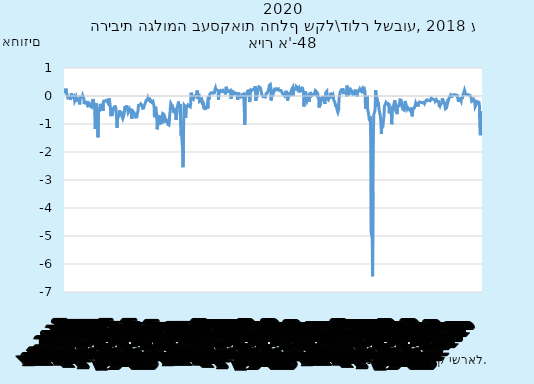
| Category | הריבית הגלומה בעסקאות החלף - שקל\דולר |
|---|---|
| 2018-01-01 | 0.102 |
| 2018-01-02 | 0.222 |
| 2018-01-03 | 0.263 |
| 2018-01-04 | 0.066 |
| 2018-01-05 | 0.102 |
| 2018-01-06 | 0.102 |
| 2018-01-07 | 0.102 |
| 2018-01-08 | -0.067 |
| 2018-01-09 | -0.054 |
| 2018-01-10 | -0.064 |
| 2018-01-11 | -0.05 |
| 2018-01-12 | -0.033 |
| 2018-01-13 | -0.033 |
| 2018-01-14 | -0.033 |
| 2018-01-15 | -0.141 |
| 2018-01-16 | -0.043 |
| 2018-01-17 | 0.098 |
| 2018-01-18 | 0.023 |
| 2018-01-19 | -0.019 |
| 2018-01-20 | -0.019 |
| 2018-01-21 | -0.019 |
| 2018-01-22 | -0.047 |
| 2018-01-23 | -0.054 |
| 2018-01-24 | -0.008 |
| 2018-01-25 | -0.062 |
| 2018-01-26 | -0.181 |
| 2018-01-27 | -0.181 |
| 2018-01-28 | -0.181 |
| 2018-01-29 | -0.092 |
| 2018-01-30 | -0.044 |
| 2018-01-31 | -0.092 |
| 2018-02-01 | -0.156 |
| 2018-02-02 | -0.142 |
| 2018-02-03 | -0.142 |
| 2018-02-04 | -0.142 |
| 2018-02-05 | -0.092 |
| 2018-02-06 | -0.152 |
| 2018-02-07 | -0.127 |
| 2018-02-08 | -0.3 |
| 2018-02-09 | -0.037 |
| 2018-02-10 | -0.037 |
| 2018-02-11 | -0.037 |
| 2018-02-12 | -0.046 |
| 2018-02-13 | -0.013 |
| 2018-02-14 | -0.025 |
| 2018-02-15 | -0.048 |
| 2018-02-16 | 0.014 |
| 2018-02-17 | 0.014 |
| 2018-02-18 | 0.014 |
| 2018-02-19 | -0.089 |
| 2018-02-20 | -0.288 |
| 2018-02-21 | -0.194 |
| 2018-02-22 | -0.238 |
| 2018-02-23 | -0.225 |
| 2018-02-24 | -0.225 |
| 2018-02-25 | -0.225 |
| 2018-02-26 | -0.24 |
| 2018-02-27 | -0.279 |
| 2018-02-28 | -0.177 |
| 2018-03-01 | -0.394 |
| 2018-03-02 | -0.32 |
| 2018-03-03 | -0.32 |
| 2018-03-04 | -0.32 |
| 2018-03-05 | -0.278 |
| 2018-03-06 | -0.275 |
| 2018-03-07 | -0.308 |
| 2018-03-08 | -0.36 |
| 2018-03-09 | -0.395 |
| 2018-03-10 | -0.395 |
| 2018-03-11 | -0.395 |
| 2018-03-12 | -0.322 |
| 2018-03-13 | -0.213 |
| 2018-03-14 | -0.237 |
| 2018-03-15 | -0.107 |
| 2018-03-16 | -0.192 |
| 2018-03-17 | -0.192 |
| 2018-03-18 | -0.192 |
| 2018-03-19 | -0.381 |
| 2018-03-20 | -0.816 |
| 2018-03-21 | -1.178 |
| 2018-03-22 | -0.298 |
| 2018-03-23 | -0.255 |
| 2018-03-24 | -0.255 |
| 2018-03-25 | -0.255 |
| 2018-03-26 | -0.576 |
| 2018-03-27 | -0.474 |
| 2018-03-28 | -1.474 |
| 2018-03-29 | -0.523 |
| 2018-03-30 | -0.517 |
| 2018-03-31 | -0.517 |
| 2018-04-01 | -0.517 |
| 2018-04-02 | -0.509 |
| 2018-04-03 | -0.282 |
| 2018-04-04 | -0.365 |
| 2018-04-05 | -0.435 |
| 2018-04-06 | -0.43 |
| 2018-04-07 | -0.43 |
| 2018-04-08 | -0.43 |
| 2018-04-09 | -0.36 |
| 2018-04-10 | -0.536 |
| 2018-04-11 | -0.235 |
| 2018-04-12 | -0.184 |
| 2018-04-13 | -0.188 |
| 2018-04-14 | -0.188 |
| 2018-04-15 | -0.188 |
| 2018-04-16 | -0.222 |
| 2018-04-17 | -0.161 |
| 2018-04-18 | -0.158 |
| 2018-04-19 | -0.187 |
| 2018-04-20 | -0.19 |
| 2018-04-21 | -0.19 |
| 2018-04-22 | -0.19 |
| 2018-04-23 | -0.243 |
| 2018-04-24 | -0.187 |
| 2018-04-25 | -0.135 |
| 2018-04-26 | -0.081 |
| 2018-04-27 | -0.13 |
| 2018-04-28 | -0.13 |
| 2018-04-29 | -0.13 |
| 2018-04-30 | -0.459 |
| 2018-05-01 | -0.72 |
| 2018-05-02 | -0.419 |
| 2018-05-03 | -0.41 |
| 2018-05-04 | -0.708 |
| 2018-05-05 | -0.708 |
| 2018-05-06 | -0.708 |
| 2018-05-07 | -0.437 |
| 2018-05-08 | -0.408 |
| 2018-05-09 | -0.435 |
| 2018-05-10 | -0.416 |
| 2018-05-11 | -0.341 |
| 2018-05-12 | -0.341 |
| 2018-05-13 | -0.341 |
| 2018-05-14 | -0.463 |
| 2018-05-15 | -0.604 |
| 2018-05-16 | -0.606 |
| 2018-05-17 | -1.14 |
| 2018-05-18 | -0.83 |
| 2018-05-19 | -0.83 |
| 2018-05-20 | -0.83 |
| 2018-05-21 | -0.711 |
| 2018-05-22 | -0.658 |
| 2018-05-23 | -0.596 |
| 2018-05-24 | -0.511 |
| 2018-05-25 | -0.622 |
| 2018-05-26 | -0.622 |
| 2018-05-27 | -0.622 |
| 2018-05-28 | -0.606 |
| 2018-05-29 | -0.714 |
| 2018-05-30 | -0.722 |
| 2018-05-31 | -0.765 |
| 2018-06-01 | -0.805 |
| 2018-06-02 | -0.805 |
| 2018-06-03 | -0.805 |
| 2018-06-04 | -0.675 |
| 2018-06-05 | -0.595 |
| 2018-06-06 | -0.419 |
| 2018-06-07 | -0.413 |
| 2018-06-08 | -0.428 |
| 2018-06-09 | -0.428 |
| 2018-06-10 | -0.428 |
| 2018-06-11 | -0.331 |
| 2018-06-12 | -0.35 |
| 2018-06-13 | -0.441 |
| 2018-06-14 | -0.447 |
| 2018-06-15 | -0.586 |
| 2018-06-16 | -0.586 |
| 2018-06-17 | -0.586 |
| 2018-06-18 | -0.493 |
| 2018-06-19 | -0.559 |
| 2018-06-20 | -0.512 |
| 2018-06-21 | -0.489 |
| 2018-06-22 | -0.447 |
| 2018-06-23 | -0.447 |
| 2018-06-24 | -0.447 |
| 2018-06-25 | -0.803 |
| 2018-06-26 | -0.495 |
| 2018-06-27 | -0.554 |
| 2018-06-28 | -0.578 |
| 2018-06-29 | -0.583 |
| 2018-06-30 | -0.583 |
| 2018-07-01 | -0.583 |
| 2018-07-02 | -0.634 |
| 2018-07-03 | -0.627 |
| 2018-07-04 | -0.695 |
| 2018-07-05 | -0.756 |
| 2018-07-06 | -0.748 |
| 2018-07-07 | -0.748 |
| 2018-07-08 | -0.748 |
| 2018-07-09 | -0.64 |
| 2018-07-10 | -0.641 |
| 2018-07-11 | -0.532 |
| 2018-07-12 | -0.336 |
| 2018-07-13 | -0.325 |
| 2018-07-14 | -0.325 |
| 2018-07-15 | -0.325 |
| 2018-07-16 | -0.292 |
| 2018-07-17 | -0.304 |
| 2018-07-18 | -0.276 |
| 2018-07-19 | -0.299 |
| 2018-07-20 | -0.313 |
| 2018-07-21 | -0.313 |
| 2018-07-22 | -0.313 |
| 2018-07-23 | -0.441 |
| 2018-07-24 | -0.445 |
| 2018-07-25 | -0.417 |
| 2018-07-26 | -0.429 |
| 2018-07-27 | -0.354 |
| 2018-07-28 | -0.354 |
| 2018-07-29 | -0.354 |
| 2018-07-30 | -0.256 |
| 2018-07-31 | -0.216 |
| 2018-08-01 | -0.164 |
| 2018-08-02 | -0.14 |
| 2018-08-03 | -0.152 |
| 2018-08-04 | -0.152 |
| 2018-08-05 | -0.152 |
| 2018-08-06 | -0.054 |
| 2018-08-07 | -0.075 |
| 2018-08-08 | -0.084 |
| 2018-08-09 | -0.15 |
| 2018-08-10 | -0.17 |
| 2018-08-11 | -0.17 |
| 2018-08-12 | -0.17 |
| 2018-08-13 | -0.247 |
| 2018-08-14 | -0.176 |
| 2018-08-15 | -0.168 |
| 2018-08-16 | -0.221 |
| 2018-08-17 | -0.189 |
| 2018-08-18 | -0.189 |
| 2018-08-19 | -0.189 |
| 2018-08-20 | -0.255 |
| 2018-08-21 | -0.265 |
| 2018-08-22 | -0.356 |
| 2018-08-23 | -0.757 |
| 2018-08-24 | -0.442 |
| 2018-08-25 | -0.442 |
| 2018-08-26 | -0.442 |
| 2018-08-27 | -0.429 |
| 2018-08-28 | -0.573 |
| 2018-08-29 | -0.648 |
| 2018-08-30 | -1.189 |
| 2018-08-31 | -1.149 |
| 2018-09-01 | -1.149 |
| 2018-09-02 | -1.149 |
| 2018-09-03 | -0.748 |
| 2018-09-04 | -0.692 |
| 2018-09-05 | -0.724 |
| 2018-09-06 | -1.032 |
| 2018-09-07 | -0.843 |
| 2018-09-08 | -0.843 |
| 2018-09-09 | -0.843 |
| 2018-09-10 | -0.812 |
| 2018-09-11 | -0.81 |
| 2018-09-12 | -0.704 |
| 2018-09-13 | -0.977 |
| 2018-09-14 | -0.629 |
| 2018-09-15 | -0.629 |
| 2018-09-16 | -0.629 |
| 2018-09-17 | -0.656 |
| 2018-09-18 | -0.633 |
| 2018-09-19 | -0.659 |
| 2018-09-20 | -0.788 |
| 2018-09-21 | -0.895 |
| 2018-09-22 | -0.895 |
| 2018-09-23 | -0.895 |
| 2018-09-24 | -0.875 |
| 2018-09-25 | -0.856 |
| 2018-09-26 | -0.909 |
| 2018-09-27 | -1.009 |
| 2018-09-28 | -1.038 |
| 2018-09-29 | -1.038 |
| 2018-09-30 | -1.038 |
| 2018-10-01 | -0.928 |
| 2018-10-02 | -0.668 |
| 2018-10-03 | -0.594 |
| 2018-10-04 | -0.384 |
| 2018-10-05 | -0.272 |
| 2018-10-06 | -0.272 |
| 2018-10-07 | -0.272 |
| 2018-10-08 | -0.357 |
| 2018-10-09 | -0.317 |
| 2018-10-10 | -0.407 |
| 2018-10-11 | -0.475 |
| 2018-10-12 | -0.56 |
| 2018-10-13 | -0.56 |
| 2018-10-14 | -0.56 |
| 2018-10-15 | -0.577 |
| 2018-10-16 | -0.57 |
| 2018-10-17 | -0.436 |
| 2018-10-18 | -0.427 |
| 2018-10-19 | -0.858 |
| 2018-10-20 | -0.858 |
| 2018-10-21 | -0.858 |
| 2018-10-22 | -0.39 |
| 2018-10-23 | -0.342 |
| 2018-10-24 | -0.291 |
| 2018-10-25 | -0.2 |
| 2018-10-26 | -0.343 |
| 2018-10-27 | -0.343 |
| 2018-10-28 | -0.343 |
| 2018-10-29 | -0.407 |
| 2018-10-30 | -0.299 |
| 2018-10-31 | -1.076 |
| 2018-11-01 | -1.416 |
| 2018-11-02 | -1.114 |
| 2018-11-03 | -1.114 |
| 2018-11-04 | -1.114 |
| 2018-11-05 | -1.946 |
| 2018-11-06 | -2.541 |
| 2018-11-07 | -1.599 |
| 2018-11-08 | -0.68 |
| 2018-11-09 | -0.319 |
| 2018-11-10 | -0.319 |
| 2018-11-11 | -0.319 |
| 2018-11-12 | -0.365 |
| 2018-11-13 | -0.774 |
| 2018-11-14 | -0.436 |
| 2018-11-15 | -0.423 |
| 2018-11-16 | -0.4 |
| 2018-11-17 | -0.4 |
| 2018-11-18 | -0.4 |
| 2018-11-19 | -0.321 |
| 2018-11-20 | -0.286 |
| 2018-11-21 | -0.344 |
| 2018-11-22 | -0.365 |
| 2018-11-23 | -0.389 |
| 2018-11-24 | -0.389 |
| 2018-11-25 | -0.389 |
| 2018-11-26 | -0.287 |
| 2018-11-27 | 0.119 |
| 2018-11-28 | 0.108 |
| 2018-11-29 | 0.021 |
| 2018-11-30 | -0.094 |
| 2018-12-01 | -0.094 |
| 2018-12-02 | -0.094 |
| 2018-12-03 | -0.123 |
| 2018-12-04 | -0.077 |
| 2018-12-05 | -0.078 |
| 2018-12-06 | 0 |
| 2018-12-07 | 0.014 |
| 2018-12-08 | 0.014 |
| 2018-12-09 | 0.014 |
| 2018-12-10 | 0.017 |
| 2018-12-11 | -0.014 |
| 2018-12-12 | 0.064 |
| 2018-12-13 | 0.198 |
| 2018-12-14 | -0.096 |
| 2018-12-15 | -0.096 |
| 2018-12-16 | -0.096 |
| 2018-12-17 | 0.081 |
| 2018-12-18 | 0.012 |
| 2018-12-19 | -0.201 |
| 2018-12-20 | -0.219 |
| 2018-12-21 | -0.18 |
| 2018-12-22 | -0.18 |
| 2018-12-23 | -0.18 |
| 2018-12-24 | -0.056 |
| 2018-12-25 | -0.054 |
| 2018-12-26 | -0.192 |
| 2018-12-27 | -0.31 |
| 2018-12-28 | -0.206 |
| 2018-12-29 | -0.206 |
| 2018-12-30 | -0.206 |
| 2018-12-31 | -0.442 |
| 2019-01-01 | -0.439 |
| 2019-01-02 | -0.414 |
| 2019-01-03 | -0.457 |
| 2019-01-04 | -0.433 |
| 2019-01-05 | -0.433 |
| 2019-01-06 | -0.433 |
| 2019-01-07 | -0.437 |
| 2019-01-08 | -0.329 |
| 2019-01-09 | -0.242 |
| 2019-01-10 | -0.442 |
| 2019-01-11 | -0.07 |
| 2019-01-12 | -0.07 |
| 2019-01-13 | -0.07 |
| 2019-01-14 | -0.079 |
| 2019-01-15 | 0.062 |
| 2019-01-16 | 0.069 |
| 2019-01-17 | 0.095 |
| 2019-01-18 | 0.109 |
| 2019-01-19 | 0.109 |
| 2019-01-20 | 0.109 |
| 2019-01-21 | 0.119 |
| 2019-01-22 | 0.128 |
| 2019-01-23 | 0.114 |
| 2019-01-24 | 0.102 |
| 2019-01-25 | 0.111 |
| 2019-01-26 | 0.111 |
| 2019-01-27 | 0.111 |
| 2019-01-28 | 0.126 |
| 2019-01-29 | 0.251 |
| 2019-01-30 | 0.289 |
| 2019-01-31 | 0.224 |
| 2019-02-01 | 0.226 |
| 2019-02-02 | 0.226 |
| 2019-02-03 | 0.226 |
| 2019-02-04 | 0.258 |
| 2019-02-05 | 0.224 |
| 2019-02-06 | 0.176 |
| 2019-02-07 | -0.139 |
| 2019-02-08 | 0.156 |
| 2019-02-09 | 0.156 |
| 2019-02-10 | 0.156 |
| 2019-02-11 | 0.186 |
| 2019-02-12 | 0.143 |
| 2019-02-13 | 0.159 |
| 2019-02-14 | 0.155 |
| 2019-02-15 | 0.17 |
| 2019-02-16 | 0.17 |
| 2019-02-17 | 0.17 |
| 2019-02-18 | 0.203 |
| 2019-02-19 | 0.182 |
| 2019-02-20 | 0.156 |
| 2019-02-21 | 0.157 |
| 2019-02-22 | 0.142 |
| 2019-02-23 | 0.142 |
| 2019-02-24 | 0.142 |
| 2019-02-25 | 0.06 |
| 2019-02-26 | 0.216 |
| 2019-02-27 | 0.33 |
| 2019-02-28 | 0.295 |
| 2019-03-01 | 0.246 |
| 2019-03-02 | 0.246 |
| 2019-03-03 | 0.246 |
| 2019-03-04 | 0.159 |
| 2019-03-05 | 0.177 |
| 2019-03-06 | 0.172 |
| 2019-03-07 | 0.177 |
| 2019-03-08 | 0.198 |
| 2019-03-09 | 0.198 |
| 2019-03-10 | 0.198 |
| 2019-03-11 | 0.198 |
| 2019-03-12 | -0.105 |
| 2019-03-13 | 0.174 |
| 2019-03-14 | 0.188 |
| 2019-03-15 | 0.174 |
| 2019-03-16 | 0.174 |
| 2019-03-17 | 0.174 |
| 2019-03-18 | 0.167 |
| 2019-03-19 | 0.135 |
| 2019-03-20 | 0.074 |
| 2019-03-21 | 0.054 |
| 2019-03-22 | 0.103 |
| 2019-03-23 | 0.103 |
| 2019-03-24 | 0.103 |
| 2019-03-25 | 0.124 |
| 2019-03-26 | 0.103 |
| 2019-03-27 | 0.143 |
| 2019-03-28 | 0.139 |
| 2019-03-29 | -0.138 |
| 2019-03-30 | -0.138 |
| 2019-03-31 | -0.138 |
| 2019-04-01 | 0.117 |
| 2019-04-02 | 0.042 |
| 2019-04-03 | -0.086 |
| 2019-04-04 | -0.048 |
| 2019-04-05 | -0.014 |
| 2019-04-06 | -0.014 |
| 2019-04-07 | -0.014 |
| 2019-04-08 | -0.021 |
| 2019-04-09 | -0.03 |
| 2019-04-10 | -0.027 |
| 2019-04-11 | 0.06 |
| 2019-04-12 | 0.072 |
| 2019-04-13 | 0.072 |
| 2019-04-14 | 0.072 |
| 2019-04-15 | 0.107 |
| 2019-04-16 | 0.056 |
| 2019-04-17 | -1.027 |
| 2019-04-18 | 0.037 |
| 2019-04-19 | 0.016 |
| 2019-04-20 | 0.016 |
| 2019-04-21 | 0.016 |
| 2019-04-22 | 0.037 |
| 2019-04-23 | 0.124 |
| 2019-04-24 | 0.173 |
| 2019-04-25 | 0.159 |
| 2019-04-26 | 0.187 |
| 2019-04-27 | 0.187 |
| 2019-04-28 | 0.187 |
| 2019-04-29 | 0.116 |
| 2019-04-30 | -0.217 |
| 2019-05-01 | 0.085 |
| 2019-05-02 | 0.165 |
| 2019-05-03 | 0.22 |
| 2019-05-04 | 0.22 |
| 2019-05-05 | 0.22 |
| 2019-05-06 | 0.2 |
| 2019-05-07 | 0.198 |
| 2019-05-08 | 0.222 |
| 2019-05-09 | 0.232 |
| 2019-05-10 | 0.237 |
| 2019-05-11 | 0.237 |
| 2019-05-12 | 0.237 |
| 2019-05-13 | 0.29 |
| 2019-05-14 | 0.35 |
| 2019-05-15 | 0.234 |
| 2019-05-16 | -0.179 |
| 2019-05-17 | 0.15 |
| 2019-05-18 | 0.15 |
| 2019-05-19 | 0.15 |
| 2019-05-20 | 0.072 |
| 2019-05-21 | 0.175 |
| 2019-05-22 | 0.234 |
| 2019-05-23 | 0.213 |
| 2019-05-24 | 0.327 |
| 2019-05-25 | 0.327 |
| 2019-05-26 | 0.327 |
| 2019-05-27 | 0.306 |
| 2019-05-28 | 0.316 |
| 2019-05-29 | 0.24 |
| 2019-05-30 | 0.188 |
| 2019-05-31 | 0.065 |
| 2019-06-01 | 0.065 |
| 2019-06-02 | 0.065 |
| 2019-06-03 | 0.003 |
| 2019-06-04 | 0.027 |
| 2019-06-05 | -0.072 |
| 2019-06-06 | 0.036 |
| 2019-06-07 | -0.018 |
| 2019-06-08 | -0.018 |
| 2019-06-09 | -0.018 |
| 2019-06-10 | -0.034 |
| 2019-06-11 | 0.012 |
| 2019-06-12 | 0.089 |
| 2019-06-13 | 0.117 |
| 2019-06-14 | 0.105 |
| 2019-06-15 | 0.105 |
| 2019-06-16 | 0.105 |
| 2019-06-17 | 0.133 |
| 2019-06-18 | 0.216 |
| 2019-06-19 | 0.277 |
| 2019-06-20 | 0.38 |
| 2019-06-21 | 0.413 |
| 2019-06-22 | 0.413 |
| 2019-06-23 | 0.413 |
| 2019-06-24 | 0.301 |
| 2019-06-25 | -0.158 |
| 2019-06-26 | 0.128 |
| 2019-06-27 | 0.116 |
| 2019-06-28 | 0.159 |
| 2019-06-29 | 0.159 |
| 2019-06-30 | 0.159 |
| 2019-07-01 | 0.197 |
| 2019-07-02 | 0.142 |
| 2019-07-03 | 0.188 |
| 2019-07-04 | 0.198 |
| 2019-07-05 | 0.207 |
| 2019-07-06 | 0.207 |
| 2019-07-07 | 0.207 |
| 2019-07-08 | 0.259 |
| 2019-07-09 | 0.276 |
| 2019-07-10 | 0.236 |
| 2019-07-11 | 0.231 |
| 2019-07-12 | 0.254 |
| 2019-07-13 | 0.254 |
| 2019-07-14 | 0.254 |
| 2019-07-15 | 0.207 |
| 2019-07-16 | 0.2 |
| 2019-07-17 | 0.182 |
| 2019-07-18 | 0.199 |
| 2019-07-19 | 0.197 |
| 2019-07-20 | 0.197 |
| 2019-07-21 | 0.197 |
| 2019-07-22 | 0.176 |
| 2019-07-23 | 0.148 |
| 2019-07-24 | 0.1 |
| 2019-07-25 | 0.118 |
| 2019-07-26 | 0.07 |
| 2019-07-27 | 0.07 |
| 2019-07-28 | 0.07 |
| 2019-07-29 | 0.048 |
| 2019-07-30 | 0.012 |
| 2019-07-31 | 0.003 |
| 2019-08-01 | 0.089 |
| 2019-08-02 | 0.144 |
| 2019-08-03 | 0.144 |
| 2019-08-04 | 0.144 |
| 2019-08-05 | 0.141 |
| 2019-08-06 | 0.119 |
| 2019-08-07 | -0.163 |
| 2019-08-08 | -0.196 |
| 2019-08-09 | -0.009 |
| 2019-08-10 | -0.009 |
| 2019-08-11 | -0.009 |
| 2019-08-12 | 0.123 |
| 2019-08-13 | 0.122 |
| 2019-08-14 | -0.008 |
| 2019-08-15 | 0.066 |
| 2019-08-16 | 0.158 |
| 2019-08-17 | 0.158 |
| 2019-08-18 | 0.158 |
| 2019-08-19 | 0.268 |
| 2019-08-20 | 0.267 |
| 2019-08-21 | 0.314 |
| 2019-08-22 | 0.017 |
| 2019-08-23 | 0.269 |
| 2019-08-24 | 0.269 |
| 2019-08-25 | 0.269 |
| 2019-08-26 | 0.241 |
| 2019-08-27 | 0.244 |
| 2019-08-28 | 0.232 |
| 2019-08-29 | 0.239 |
| 2019-08-30 | 0.337 |
| 2019-08-31 | 0.337 |
| 2019-09-01 | 0.337 |
| 2019-09-02 | 0.298 |
| 2019-09-03 | 0.248 |
| 2019-09-04 | 0.26 |
| 2019-09-05 | 0.285 |
| 2019-09-06 | 0.129 |
| 2019-09-07 | 0.129 |
| 2019-09-08 | 0.129 |
| 2019-09-09 | 0.247 |
| 2019-09-10 | 0.272 |
| 2019-09-11 | 0.265 |
| 2019-09-12 | 0.279 |
| 2019-09-13 | 0.212 |
| 2019-09-14 | 0.212 |
| 2019-09-15 | 0.212 |
| 2019-09-16 | 0.242 |
| 2019-09-17 | 0.207 |
| 2019-09-18 | 0.093 |
| 2019-09-19 | -0.376 |
| 2019-09-20 | -0.103 |
| 2019-09-21 | -0.103 |
| 2019-09-22 | -0.103 |
| 2019-09-23 | 0.172 |
| 2019-09-24 | 0.14 |
| 2019-09-25 | 0.183 |
| 2019-09-26 | -0.124 |
| 2019-09-27 | -0.171 |
| 2019-09-28 | -0.171 |
| 2019-09-29 | -0.171 |
| 2019-09-30 | -0.033 |
| 2019-10-01 | 0.04 |
| 2019-10-02 | 0.043 |
| 2019-10-03 | -0.206 |
| 2019-10-04 | 0.091 |
| 2019-10-05 | 0.091 |
| 2019-10-06 | 0.091 |
| 2019-10-07 | 0.104 |
| 2019-10-08 | 0.099 |
| 2019-10-09 | 0.064 |
| 2019-10-10 | 0.013 |
| 2019-10-11 | 0.044 |
| 2019-10-12 | 0.044 |
| 2019-10-13 | 0.044 |
| 2019-10-14 | 0.021 |
| 2019-10-15 | 0.042 |
| 2019-10-16 | 0.053 |
| 2019-10-17 | 0.098 |
| 2019-10-18 | 0.152 |
| 2019-10-19 | 0.152 |
| 2019-10-20 | 0.152 |
| 2019-10-21 | 0.073 |
| 2019-10-22 | 0.143 |
| 2019-10-23 | 0.164 |
| 2019-10-24 | 0.13 |
| 2019-10-25 | 0.088 |
| 2019-10-26 | 0.088 |
| 2019-10-27 | 0.088 |
| 2019-10-28 | -0.12 |
| 2019-10-29 | -0.412 |
| 2019-10-30 | -0.059 |
| 2019-10-31 | -0.358 |
| 2019-11-01 | -0.108 |
| 2019-11-02 | -0.108 |
| 2019-11-03 | -0.108 |
| 2019-11-04 | -0.14 |
| 2019-11-05 | -0.123 |
| 2019-11-06 | -0.049 |
| 2019-11-07 | -0.043 |
| 2019-11-08 | -0.044 |
| 2019-11-09 | -0.044 |
| 2019-11-10 | -0.044 |
| 2019-11-11 | -0.076 |
| 2019-11-12 | -0.218 |
| 2019-11-13 | -0.286 |
| 2019-11-14 | -0.028 |
| 2019-11-15 | 0.116 |
| 2019-11-16 | 0.116 |
| 2019-11-17 | 0.116 |
| 2019-11-18 | 0.165 |
| 2019-11-19 | -0.096 |
| 2019-11-20 | -0.07 |
| 2019-11-21 | -0.11 |
| 2019-11-22 | -0.137 |
| 2019-11-23 | -0.137 |
| 2019-11-24 | -0.137 |
| 2019-11-25 | 0.01 |
| 2019-11-26 | -0.103 |
| 2019-11-27 | 0.021 |
| 2019-11-28 | 0.115 |
| 2019-11-29 | 0.06 |
| 2019-11-30 | 0.06 |
| 2019-12-01 | 0.06 |
| 2019-12-02 | 0.01 |
| 2019-12-03 | 0.019 |
| 2019-12-04 | 0.05 |
| 2019-12-05 | -0.005 |
| 2019-12-06 | -0.142 |
| 2019-12-07 | -0.142 |
| 2019-12-08 | -0.142 |
| 2019-12-09 | -0.218 |
| 2019-12-10 | -0.187 |
| 2019-12-11 | -0.338 |
| 2019-12-12 | -0.385 |
| 2019-12-13 | -0.313 |
| 2019-12-14 | -0.313 |
| 2019-12-15 | -0.313 |
| 2019-12-16 | -0.541 |
| 2019-12-17 | -0.582 |
| 2019-12-18 | -0.581 |
| 2019-12-19 | -0.486 |
| 2019-12-20 | -0.093 |
| 2019-12-21 | -0.093 |
| 2019-12-22 | -0.093 |
| 2019-12-23 | 0.137 |
| 2019-12-24 | 0.172 |
| 2019-12-25 | 0.2 |
| 2019-12-26 | 0.188 |
| 2019-12-27 | 0.181 |
| 2019-12-28 | 0.181 |
| 2019-12-29 | 0.181 |
| 2019-12-30 | 0.273 |
| 2019-12-31 | 0.119 |
| 2020-01-01 | 0.123 |
| 2020-01-02 | 0.117 |
| 2020-01-03 | 0.124 |
| 2020-01-04 | 0.124 |
| 2020-01-05 | 0.124 |
| 2020-01-06 | 0.108 |
| 2020-01-07 | 0.095 |
| 2020-01-08 | 0.161 |
| 2020-01-09 | -0.014 |
| 2020-01-10 | 0.369 |
| 2020-01-11 | 0.369 |
| 2020-01-12 | 0.369 |
| 2020-01-13 | 0.122 |
| 2020-01-14 | 0.005 |
| 2020-01-15 | 0.081 |
| 2020-01-16 | 0.186 |
| 2020-01-17 | 0.296 |
| 2020-01-18 | 0.296 |
| 2020-01-19 | 0.296 |
| 2020-01-20 | 0.151 |
| 2020-01-21 | 0.144 |
| 2020-01-22 | 0.146 |
| 2020-01-23 | 0.167 |
| 2020-01-24 | 0.082 |
| 2020-01-25 | 0.082 |
| 2020-01-26 | 0.082 |
| 2020-01-27 | 0.058 |
| 2020-01-28 | 0.019 |
| 2020-01-29 | 0.143 |
| 2020-01-30 | 0.166 |
| 2020-01-31 | 0.19 |
| 2020-02-01 | 0.19 |
| 2020-02-02 | 0.19 |
| 2020-02-03 | 0.185 |
| 2020-02-04 | 0.201 |
| 2020-02-05 | 0.184 |
| 2020-02-06 | -0.02 |
| 2020-02-07 | 0.158 |
| 2020-02-08 | 0.158 |
| 2020-02-09 | 0.158 |
| 2020-02-10 | 0.197 |
| 2020-02-11 | 0.213 |
| 2020-02-12 | 0.25 |
| 2020-02-13 | 0.22 |
| 2020-02-14 | 0.176 |
| 2020-02-15 | 0.176 |
| 2020-02-16 | 0.176 |
| 2020-02-17 | 0.166 |
| 2020-02-18 | 0.186 |
| 2020-02-19 | 0.222 |
| 2020-02-20 | 0.096 |
| 2020-02-21 | 0.289 |
| 2020-02-22 | 0.289 |
| 2020-02-23 | 0.289 |
| 2020-02-24 | 0.286 |
| 2020-02-25 | 0.223 |
| 2020-02-26 | 0.162 |
| 2020-02-27 | -0.23 |
| 2020-02-28 | -0.461 |
| 2020-02-29 | -0.461 |
| 2020-03-01 | -0.461 |
| 2020-03-02 | -0.289 |
| 2020-03-03 | 0.007 |
| 2020-03-04 | -0.479 |
| 2020-03-05 | -0.492 |
| 2020-03-06 | -0.595 |
| 2020-03-07 | -0.595 |
| 2020-03-08 | -0.595 |
| 2020-03-09 | -0.891 |
| 2020-03-10 | -0.902 |
| 2020-03-11 | -0.727 |
| 2020-03-12 | -1.401 |
| 2020-03-13 | -4.846 |
| 2020-03-14 | -4.846 |
| 2020-03-15 | -4.846 |
| 2020-03-16 | -5.098 |
| 2020-03-17 | -6.439 |
| 2020-03-18 | -3.416 |
| 2020-03-19 | -1.561 |
| 2020-03-20 | -0.657 |
| 2020-03-21 | -0.657 |
| 2020-03-22 | -0.657 |
| 2020-03-23 | -0.543 |
| 2020-03-24 | -0.355 |
| 2020-03-25 | 0.211 |
| 2020-03-26 | 0.058 |
| 2020-03-27 | 0.01 |
| 2020-03-28 | 0.01 |
| 2020-03-29 | 0.01 |
| 2020-03-30 | -0.142 |
| 2020-03-31 | -0.383 |
| 2020-04-01 | -0.215 |
| 2020-04-02 | -0.345 |
| 2020-04-03 | -0.488 |
| 2020-04-04 | -0.488 |
| 2020-04-05 | -0.488 |
| 2020-04-06 | -0.684 |
| 2020-04-07 | -0.798 |
| 2020-04-08 | -1.024 |
| 2020-04-09 | -1.354 |
| 2020-04-10 | -1.105 |
| 2020-04-11 | -1.105 |
| 2020-04-12 | -1.105 |
| 2020-04-13 | -1.088 |
| 2020-04-14 | -0.94 |
| 2020-04-15 | -0.969 |
| 2020-04-16 | -0.691 |
| 2020-04-17 | -0.38 |
| 2020-04-18 | -0.38 |
| 2020-04-19 | -0.38 |
| 2020-04-20 | -0.272 |
| 2020-04-21 | -0.234 |
| 2020-04-22 | -0.269 |
| 2020-04-23 | -0.279 |
| 2020-04-24 | -0.262 |
| 2020-04-25 | -0.262 |
| 2020-04-26 | -0.262 |
| 2020-04-27 | -0.289 |
| 2020-04-28 | -0.31 |
| 2020-04-29 | -0.269 |
| 2020-04-30 | -0.615 |
| 2020-05-01 | -0.498 |
| 2020-05-02 | -0.498 |
| 2020-05-03 | -0.498 |
| 2020-05-04 | -0.489 |
| 2020-05-05 | -0.577 |
| 2020-05-06 | -1.007 |
| 2020-05-07 | -0.948 |
| 2020-05-08 | -0.349 |
| 2020-05-09 | -0.349 |
| 2020-05-10 | -0.349 |
| 2020-05-11 | -0.425 |
| 2020-05-12 | -0.271 |
| 2020-05-13 | -0.217 |
| 2020-05-14 | -0.156 |
| 2020-05-15 | -0.226 |
| 2020-05-16 | -0.226 |
| 2020-05-17 | -0.226 |
| 2020-05-18 | -0.388 |
| 2020-05-19 | -0.519 |
| 2020-05-20 | -0.648 |
| 2020-05-21 | -0.388 |
| 2020-05-22 | -0.366 |
| 2020-05-23 | -0.366 |
| 2020-05-24 | -0.366 |
| 2020-05-25 | -0.328 |
| 2020-05-26 | -0.276 |
| 2020-05-27 | -0.209 |
| 2020-05-28 | -0.139 |
| 2020-05-29 | -0.15 |
| 2020-05-30 | -0.15 |
| 2020-05-31 | -0.15 |
| 2020-06-01 | -0.275 |
| 2020-06-02 | -0.384 |
| 2020-06-03 | -0.399 |
| 2020-06-04 | -0.404 |
| 2020-06-05 | -0.483 |
| 2020-06-06 | -0.483 |
| 2020-06-07 | -0.483 |
| 2020-06-08 | -0.507 |
| 2020-06-09 | -0.389 |
| 2020-06-10 | -0.182 |
| 2020-06-11 | -0.179 |
| 2020-06-12 | -0.265 |
| 2020-06-13 | -0.265 |
| 2020-06-14 | -0.265 |
| 2020-06-15 | -0.418 |
| 2020-06-16 | -0.369 |
| 2020-06-17 | -0.423 |
| 2020-06-18 | -0.483 |
| 2020-06-19 | -0.467 |
| 2020-06-20 | -0.467 |
| 2020-06-21 | -0.467 |
| 2020-06-22 | -0.464 |
| 2020-06-23 | -0.509 |
| 2020-06-24 | -0.416 |
| 2020-06-25 | -0.425 |
| 2020-06-26 | -0.494 |
| 2020-06-27 | -0.494 |
| 2020-06-28 | -0.494 |
| 2020-06-29 | -0.726 |
| 2020-06-30 | -0.588 |
| 2020-07-01 | -0.448 |
| 2020-07-02 | -0.413 |
| 2020-07-03 | -0.437 |
| 2020-07-04 | -0.437 |
| 2020-07-05 | -0.437 |
| 2020-07-06 | -0.415 |
| 2020-07-07 | -0.326 |
| 2020-07-08 | -0.259 |
| 2020-07-09 | -0.298 |
| 2020-07-10 | -0.28 |
| 2020-07-11 | -0.28 |
| 2020-07-12 | -0.28 |
| 2020-07-13 | -0.313 |
| 2020-07-14 | -0.377 |
| 2020-07-15 | -0.269 |
| 2020-07-16 | -0.251 |
| 2020-07-17 | -0.218 |
| 2020-07-18 | -0.218 |
| 2020-07-19 | -0.218 |
| 2020-07-20 | -0.218 |
| 2020-07-21 | -0.238 |
| 2020-07-22 | -0.25 |
| 2020-07-23 | -0.232 |
| 2020-07-24 | -0.241 |
| 2020-07-25 | -0.241 |
| 2020-07-26 | -0.241 |
| 2020-07-27 | -0.243 |
| 2020-07-28 | -0.229 |
| 2020-07-29 | -0.225 |
| 2020-07-30 | -0.199 |
| 2020-07-31 | -0.276 |
| 2020-08-01 | -0.276 |
| 2020-08-02 | -0.276 |
| 2020-08-03 | -0.194 |
| 2020-08-04 | -0.205 |
| 2020-08-05 | -0.184 |
| 2020-08-06 | -0.137 |
| 2020-08-07 | -0.163 |
| 2020-08-08 | -0.163 |
| 2020-08-09 | -0.163 |
| 2020-08-10 | -0.154 |
| 2020-08-11 | -0.157 |
| 2020-08-12 | -0.153 |
| 2020-08-13 | -0.151 |
| 2020-08-14 | -0.172 |
| 2020-08-15 | -0.172 |
| 2020-08-16 | -0.172 |
| 2020-08-17 | -0.147 |
| 2020-08-18 | -0.08 |
| 2020-08-19 | -0.104 |
| 2020-08-20 | -0.107 |
| 2020-08-21 | -0.111 |
| 2020-08-22 | -0.111 |
| 2020-08-23 | -0.111 |
| 2020-08-24 | -0.121 |
| 2020-08-25 | -0.096 |
| 2020-08-26 | -0.118 |
| 2020-08-27 | -0.136 |
| 2020-08-28 | -0.186 |
| 2020-08-29 | -0.186 |
| 2020-08-30 | -0.186 |
| 2020-08-31 | -0.125 |
| 2020-09-01 | -0.121 |
| 2020-09-02 | -0.124 |
| 2020-09-03 | -0.187 |
| 2020-09-04 | -0.2 |
| 2020-09-05 | -0.2 |
| 2020-09-06 | -0.2 |
| 2020-09-07 | -0.217 |
| 2020-09-08 | -0.39 |
| 2020-09-09 | -0.31 |
| 2020-09-10 | -0.348 |
| 2020-09-11 | -0.311 |
| 2020-09-12 | -0.311 |
| 2020-09-13 | -0.311 |
| 2020-09-14 | -0.25 |
| 2020-09-15 | -0.164 |
| 2020-09-16 | -0.08 |
| 2020-09-17 | -0.079 |
| 2020-09-18 | -0.174 |
| 2020-09-19 | -0.174 |
| 2020-09-20 | -0.174 |
| 2020-09-21 | -0.225 |
| 2020-09-22 | -0.23 |
| 2020-09-23 | -0.229 |
| 2020-09-24 | -0.457 |
| 2020-09-25 | -0.424 |
| 2020-09-26 | -0.424 |
| 2020-09-27 | -0.424 |
| 2020-09-28 | -0.421 |
| 2020-09-29 | -0.275 |
| 2020-09-30 | -0.185 |
| 2020-10-01 | -0.102 |
| 2020-10-02 | -0.15 |
| 2020-10-03 | -0.15 |
| 2020-10-04 | -0.15 |
| 2020-10-05 | -0.018 |
| 2020-10-06 | 0 |
| 2020-10-07 | 0.023 |
| 2020-10-08 | -0.02 |
| 2020-10-09 | -0.021 |
| 2020-10-10 | -0.021 |
| 2020-10-11 | -0.021 |
| 2020-10-12 | -0.018 |
| 2020-10-13 | 0.027 |
| 2020-10-14 | 0.023 |
| 2020-10-15 | 0.055 |
| 2020-10-16 | 0.047 |
| 2020-10-17 | 0.047 |
| 2020-10-18 | 0.047 |
| 2020-10-19 | 0.045 |
| 2020-10-20 | 0.065 |
| 2020-10-21 | 0.039 |
| 2020-10-22 | 0.033 |
| 2020-10-23 | 0.026 |
| 2020-10-24 | 0.026 |
| 2020-10-25 | 0.026 |
| 2020-10-26 | 0.041 |
| 2020-10-27 | 0.013 |
| 2020-10-28 | -0.206 |
| 2020-10-29 | -0.108 |
| 2020-10-30 | -0.111 |
| 2020-10-31 | -0.111 |
| 2020-11-01 | -0.111 |
| 2020-11-02 | -0.14 |
| 2020-11-03 | -0.118 |
| 2020-11-04 | -0.19 |
| 2020-11-05 | -0.08 |
| 2020-11-06 | -0.068 |
| 2020-11-07 | -0.068 |
| 2020-11-08 | -0.068 |
| 2020-11-09 | 0.048 |
| 2020-11-10 | 0.06 |
| 2020-11-11 | 0.062 |
| 2020-11-12 | 0.156 |
| 2020-11-13 | 0.205 |
| 2020-11-14 | 0.205 |
| 2020-11-15 | 0.205 |
| 2020-11-16 | 0.062 |
| 2020-11-17 | 0.048 |
| 2020-11-18 | 0.062 |
| 2020-11-19 | 0.055 |
| 2020-11-20 | 0.046 |
| 2020-11-21 | 0.046 |
| 2020-11-22 | 0.046 |
| 2020-11-23 | 0.053 |
| 2020-11-24 | 0.04 |
| 2020-11-25 | 0.038 |
| 2020-11-26 | 0.045 |
| 2020-11-27 | 0.014 |
| 2020-11-28 | 0.014 |
| 2020-11-29 | 0.014 |
| 2020-11-30 | -0.007 |
| 2020-12-01 | -0.077 |
| 2020-12-02 | -0.19 |
| 2020-12-03 | -0.172 |
| 2020-12-04 | -0.165 |
| 2020-12-05 | -0.165 |
| 2020-12-06 | -0.165 |
| 2020-12-07 | -0.126 |
| 2020-12-08 | -0.134 |
| 2020-12-09 | -0.119 |
| 2020-12-10 | -0.233 |
| 2020-12-11 | -0.381 |
| 2020-12-12 | -0.381 |
| 2020-12-13 | -0.381 |
| 2020-12-14 | -0.294 |
| 2020-12-15 | -0.194 |
| 2020-12-16 | -0.196 |
| 2020-12-17 | -0.22 |
| 2020-12-18 | -0.209 |
| 2020-12-19 | -0.209 |
| 2020-12-20 | -0.209 |
| 2020-12-21 | -0.225 |
| 2020-12-22 | -0.318 |
| 2020-12-23 | -1.035 |
| 2020-12-24 | -1.36 |
| 2020-12-25 | -1.359 |
| 2020-12-26 | -1.359 |
| 2020-12-27 | -1.359 |
| 2020-12-28 | -1.359 |
| 2020-12-29 | -0.546 |
| 2020-12-30 | -0.554 |
| 2020-12-31 | -0.602 |